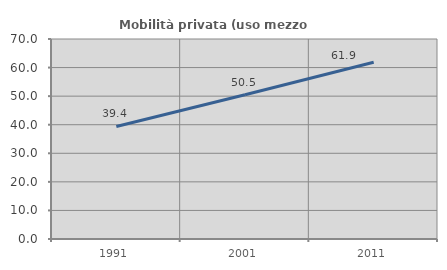
| Category | Mobilità privata (uso mezzo privato) |
|---|---|
| 1991.0 | 39.378 |
| 2001.0 | 50.507 |
| 2011.0 | 61.878 |